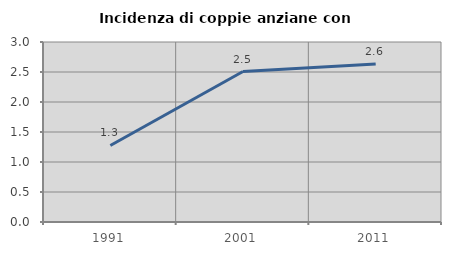
| Category | Incidenza di coppie anziane con figli |
|---|---|
| 1991.0 | 1.276 |
| 2001.0 | 2.507 |
| 2011.0 | 2.635 |